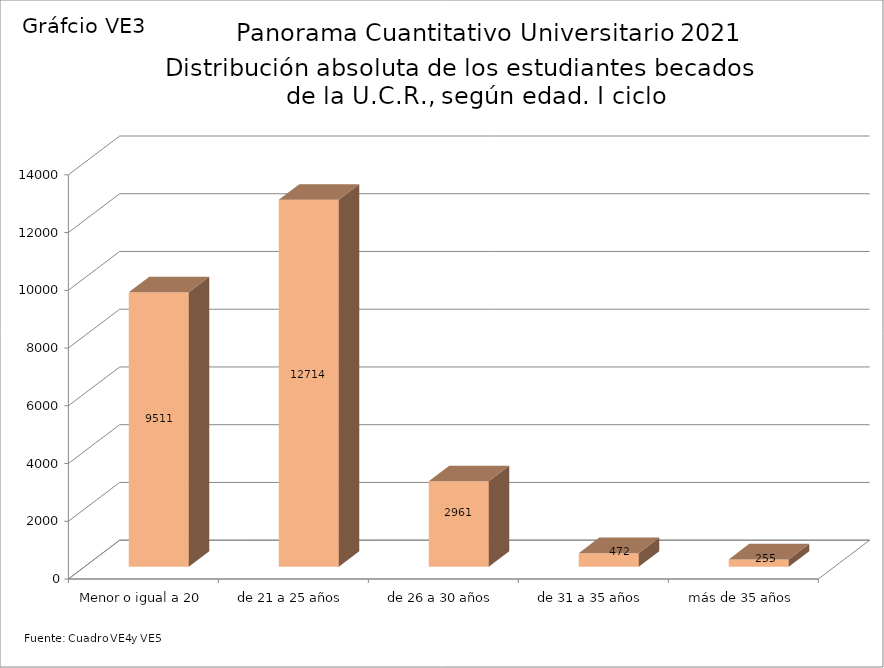
| Category | Series 0 |
|---|---|
| Menor o igual a 20 | 9511 |
| de 21 a 25 años | 12714 |
| de 26 a 30 años | 2961 |
| de 31 a 35 años | 472 |
| más de 35 años | 255 |